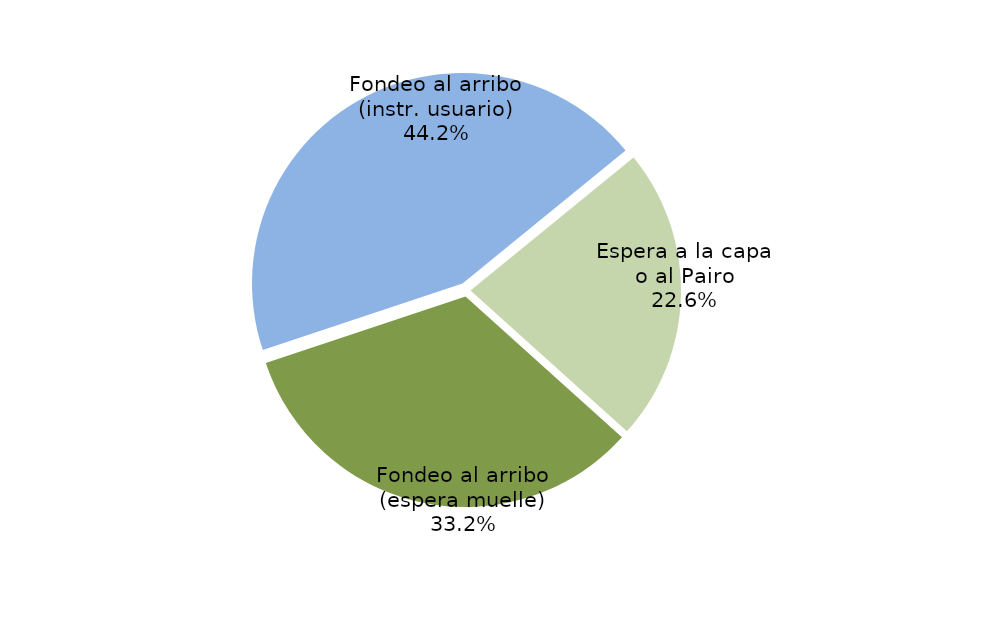
| Category | Series 0 |
|---|---|
| Fondeo al arribo (espera muelle) | 11961.243 |
| Fondeo al arribo (instr. usuario) | 15923.933 |
| Espera a la capa o al Pairo | 8124.683 |